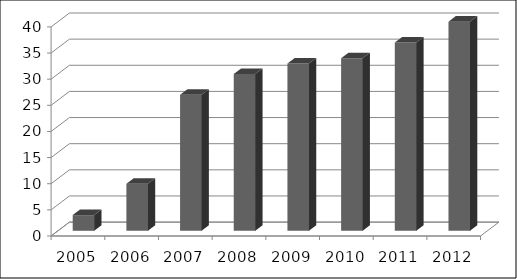
| Category | Número empresas |
|---|---|
| 2005.0 | 3 |
| 2006.0 | 9 |
| 2007.0 | 26 |
| 2008.0 | 30 |
| 2009.0 | 32 |
| 2010.0 | 33 |
| 2011.0 | 36 |
| 2012.0 | 40 |